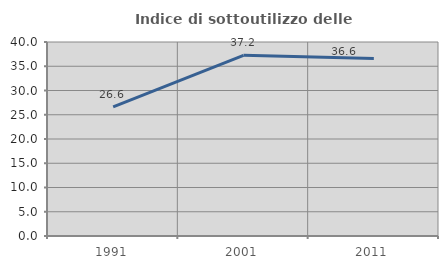
| Category | Indice di sottoutilizzo delle abitazioni  |
|---|---|
| 1991.0 | 26.606 |
| 2001.0 | 37.245 |
| 2011.0 | 36.612 |